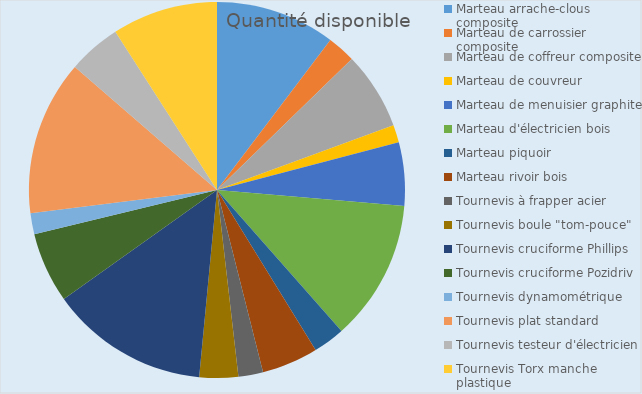
| Category | Quantité disponible |
|---|---|
| Marteau arrache-clous composite | 34 |
| Marteau de carrossier composite | 8 |
| Marteau de coffreur composite | 22 |
| Marteau de couvreur | 5 |
| Marteau de menuisier graphite | 18 |
| Marteau d'électricien bois | 40 |
| Marteau piquoir | 9 |
| Marteau rivoir bois | 16 |
| Tournevis à frapper acier | 7 |
| Tournevis boule "tom-pouce" | 11 |
| Tournevis cruciforme Phillips | 45 |
| Tournevis cruciforme Pozidriv | 20 |
| Tournevis dynamométrique | 6 |
| Tournevis plat standard | 44 |
| Tournevis testeur d'électricien | 15 |
| Tournevis Torx manche plastique | 30 |